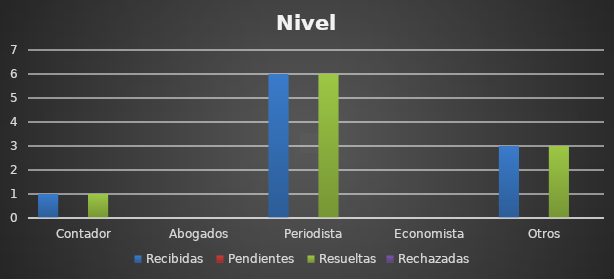
| Category | Recibidas  | Pendientes  | Resueltas | Rechazadas  |
|---|---|---|---|---|
| Contador | 1 | 0 | 1 | 0 |
| Abogados | 0 | 0 | 0 | 0 |
| Periodista | 6 | 0 | 6 | 0 |
| Economista | 0 | 0 | 0 | 0 |
| Otros | 3 | 0 | 3 | 0 |